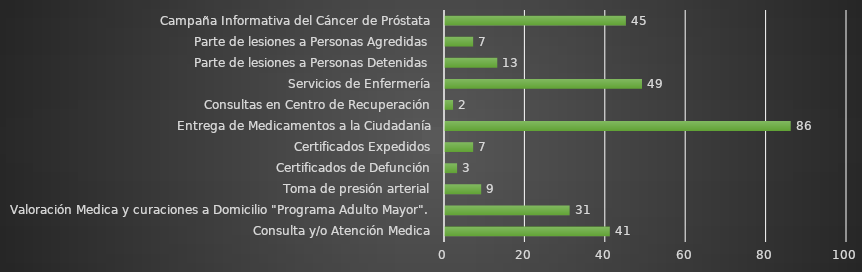
| Category | INDICADOR  |
|---|---|
| Consulta y/o Atención Medica | 41 |
| Valoración Medica y curaciones a Domicilio "Programa Adulto Mayor". | 31 |
| Toma de presión arterial | 9 |
| Certificados de Defunción | 3 |
| Certificados Expedidos | 7 |
| Entrega de Medicamentos a la Ciudadanía | 86 |
| Consultas en Centro de Recuperación | 2 |
| Servicios de Enfermería | 49 |
| Parte de lesiones a Personas Detenidas | 13 |
| Parte de lesiones a Personas Agredidas | 7 |
| Campaña Informativa del Cáncer de Próstata | 45 |